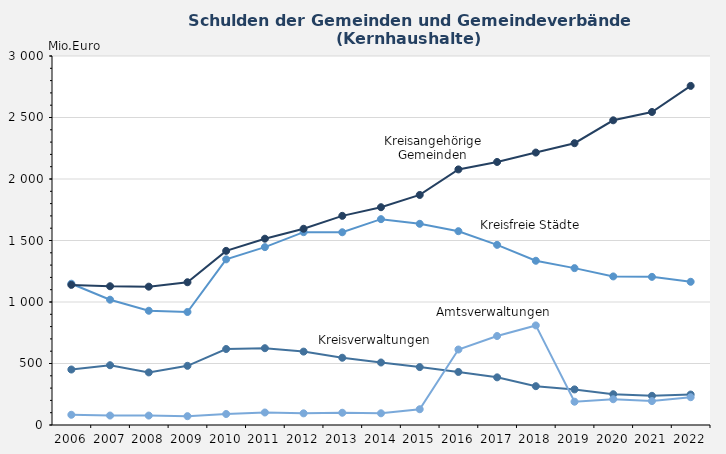
| Category | Kreisfreie Städte | Kreisverwaltungen | Kreisangehörige Gemeinden | Amtsverwaltungen |
|---|---|---|---|---|
| 2006-12-31 | 1148.685 | 450.971 | 1139.214 | 83.081 |
| 2007-12-31 | 1018.794 | 485.901 | 1128.09 | 77 |
| 2008-12-31 | 928.828 | 427.549 | 1124.734 | 76.656 |
| 2009-12-31 | 918.749 | 480.95 | 1160.738 | 71.858 |
| 2010-12-31 | 1346.654 | 617.803 | 1415.752 | 89.365 |
| 2011-12-31 | 1446.028 | 624.355 | 1514.709 | 101.622 |
| 2012-12-31 | 1567.827 | 596.621 | 1595.296 | 94.863 |
| 2013-12-31 | 1567.065 | 546.789 | 1700.382 | 99.561 |
| 2014-12-31 | 1673.41 | 508.158 | 1770.478 | 95.114 |
| 2015-12-31 | 1635.756 | 470.812 | 1870.25 | 128.185 |
| 2016-12-31 | 1575.737 | 431.207 | 2077.928 | 613.663 |
| 2017-12-31 | 1464.706 | 387.405 | 2138.452 | 723.458 |
| 2018-12-31 | 1335.215 | 315.614 | 2214.98 | 809.631 |
| 2019-12-31 | 1275.332 | 289.427 | 2291.036 | 189.311 |
| 2020-12-31 | 1207.887 | 250.246 | 2477.209 | 209.579 |
| 2021-12-31 | 1204.372 | 237.296 | 2544.894 | 194.527 |
| 2022-12-31 | 1164.325 | 247.625 | 2756.982 | 225.878 |